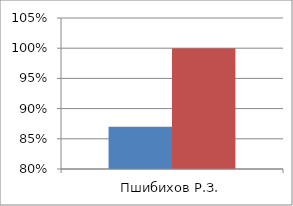
| Category | Series 0 | 2 |
|---|---|---|
| Пшибихов Р.З. | 0.87 | 1 |